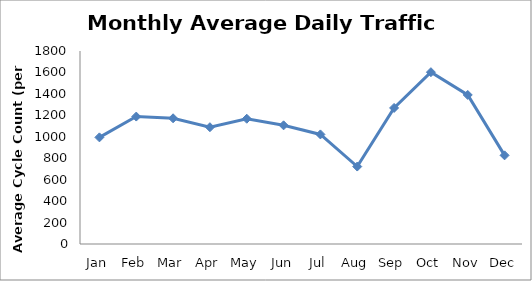
| Category | Series 0 |
|---|---|
| Jan | 994.5 |
| Feb | 1188.5 |
| Mar | 1172.5 |
| Apr | 1089.25 |
| May | 1168.25 |
| Jun | 1106.75 |
| Jul | 1022 |
| Aug | 722.25 |
| Sep | 1269 |
| Oct | 1602.5 |
| Nov | 1390 |
| Dec | 826.75 |